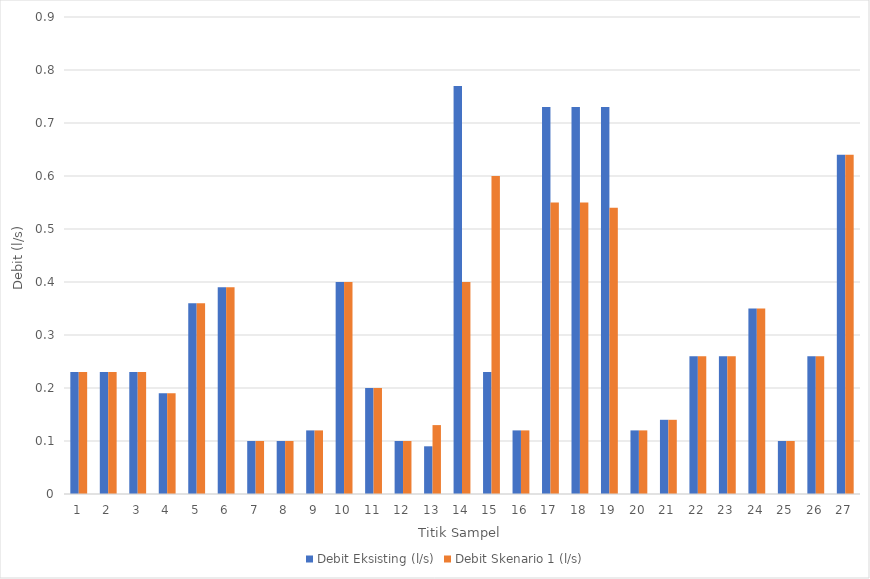
| Category | Debit Eksisting (l/s) | Debit Skenario 1 (l/s) |
|---|---|---|
| 0 | 0.23 | 0.23 |
| 1 | 0.23 | 0.23 |
| 2 | 0.23 | 0.23 |
| 3 | 0.19 | 0.19 |
| 4 | 0.36 | 0.36 |
| 5 | 0.39 | 0.39 |
| 6 | 0.1 | 0.1 |
| 7 | 0.1 | 0.1 |
| 8 | 0.12 | 0.12 |
| 9 | 0.4 | 0.4 |
| 10 | 0.2 | 0.2 |
| 11 | 0.1 | 0.1 |
| 12 | 0.09 | 0.13 |
| 13 | 0.77 | 0.4 |
| 14 | 0.23 | 0.6 |
| 15 | 0.12 | 0.12 |
| 16 | 0.73 | 0.55 |
| 17 | 0.73 | 0.55 |
| 18 | 0.73 | 0.54 |
| 19 | 0.12 | 0.12 |
| 20 | 0.14 | 0.14 |
| 21 | 0.26 | 0.26 |
| 22 | 0.26 | 0.26 |
| 23 | 0.35 | 0.35 |
| 24 | 0.1 | 0.1 |
| 25 | 0.26 | 0.26 |
| 26 | 0.64 | 0.64 |